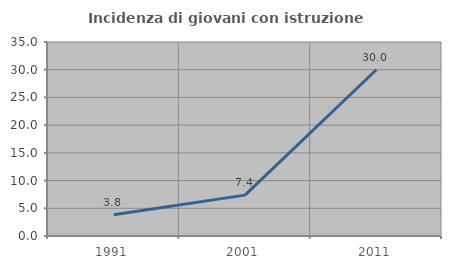
| Category | Incidenza di giovani con istruzione universitaria |
|---|---|
| 1991.0 | 3.846 |
| 2001.0 | 7.377 |
| 2011.0 | 30 |